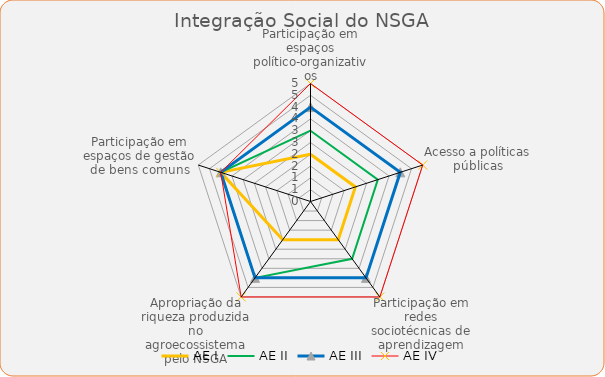
| Category | AE I | AE II | AE III | AE IV |
|---|---|---|---|---|
| Participação em espaços político-organizativos | 2 | 3 | 4 | 5 |
| Acesso a políticas públicas | 2 | 3 | 4 | 5 |
| Participação em redes sociotécnicas de aprendizagem | 2 | 3 | 4 | 5 |
| Apropriação da riqueza produzida no agroecossistema pelo NSGA | 2 | 4 | 4 | 5 |
| Participação em espaços de gestão de bens comuns | 4 | 4 | 4 | 4 |